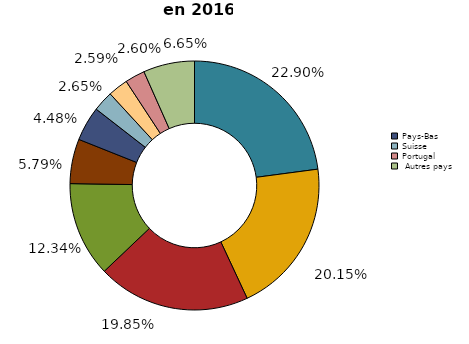
| Category | Series 0 |
|---|---|
| Royaume-Uni | 283076532.95 |
| Luxembourg | 249089269.61 |
| Belgique | 245411615.25 |
| Allemagne | 152493229.45 |
| Italie | 71584680.46 |
| Pays-Bas | 55338073.6 |
| Suisse | 32728237.96 |
| Espagne | 32196525.75 |
| Portugal | 31954375.87 |
| Autres pays | 82213425.55 |